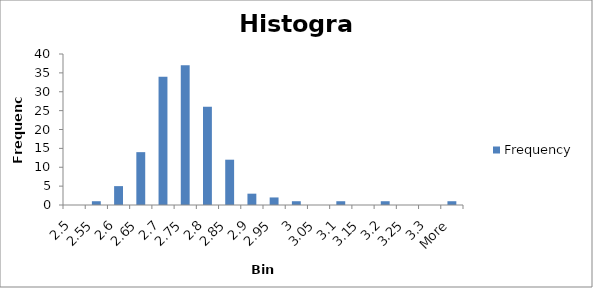
| Category | Frequency |
|---|---|
| 2.5 | 0 |
| 2.55 | 1 |
| 2.6 | 5 |
| 2.65 | 14 |
| 2.7 | 34 |
| 2.75 | 37 |
| 2.8 | 26 |
| 2.85 | 12 |
| 2.9 | 3 |
| 2.95 | 2 |
| 3 | 1 |
| 3.05 | 0 |
| 3.1 | 1 |
| 3.15 | 0 |
| 3.2 | 1 |
| 3.25 | 0 |
| 3.3 | 0 |
| More | 1 |